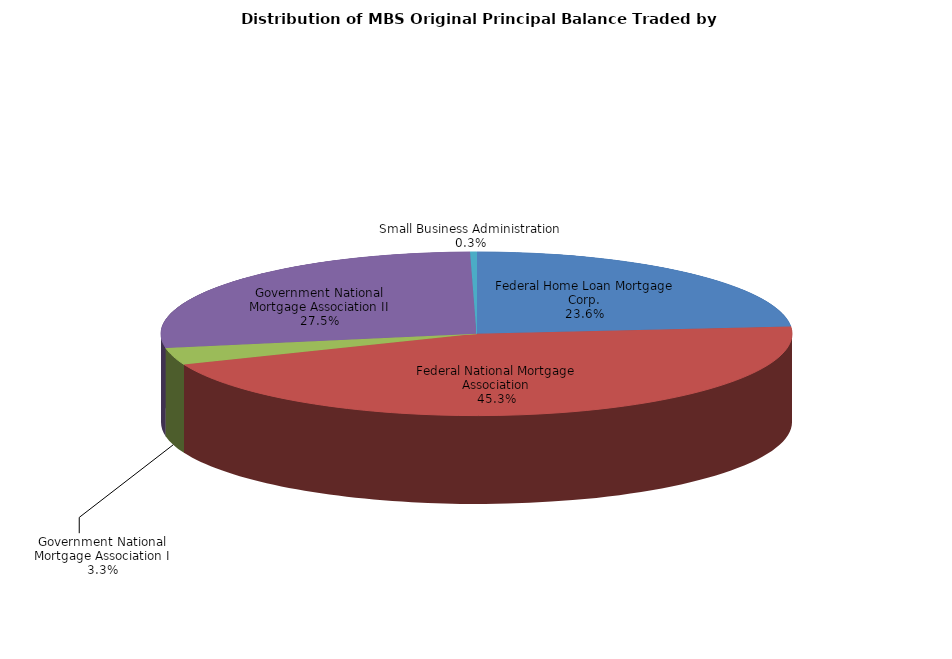
| Category | Series 0 |
|---|---|
| Federal Home Loan Mortgage Corp. | 3685303710.61 |
| Federal National Mortgage Association | 7088323099.502 |
| Government National Mortgage Association I | 520932981.318 |
| Government National Mortgage Association II | 4294249956.055 |
| Small Business Administration | 51074244.115 |